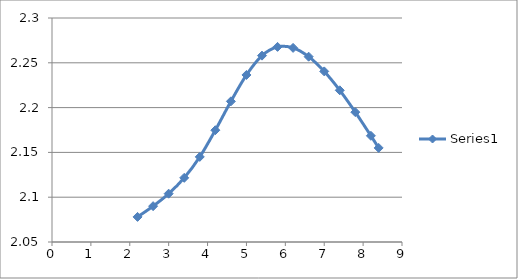
| Category | Series 0 |
|---|---|
| 2.2 | 2.078 |
| 2.6 | 2.09 |
| 3.0 | 2.104 |
| 3.4 | 2.122 |
| 3.8 | 2.145 |
| 4.2 | 2.175 |
| 4.6 | 2.207 |
| 5.0 | 2.236 |
| 5.4 | 2.258 |
| 5.8 | 2.268 |
| 6.2 | 2.267 |
| 6.6 | 2.257 |
| 7.0 | 2.24 |
| 7.4 | 2.219 |
| 7.8 | 2.195 |
| 8.2 | 2.169 |
| 8.4 | 2.155 |